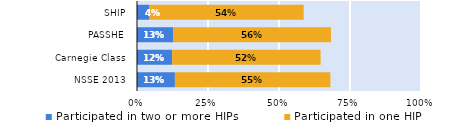
| Category | Participated in two or more HIPs | Participated in one HIP |
|---|---|---|
| NSSE 2013 | 0.133 | 0.548 |
| Carnegie Class | 0.124 | 0.523 |
| PASSHE | 0.127 | 0.556 |
| SHIP | 0.043 | 0.543 |